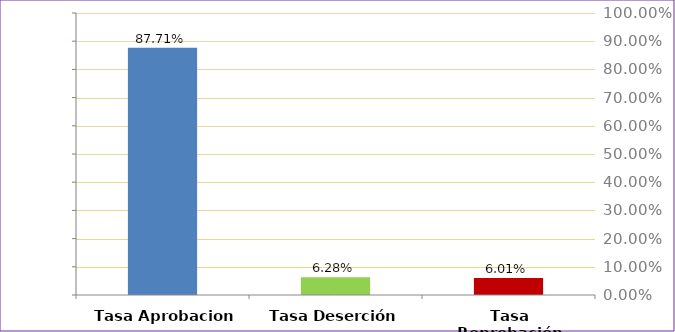
| Category | Total |
|---|---|
| Tasa Aprobacion | 0.877 |
| Tasa Deserción | 0.063 |
| Tasa Reprobación | 0.06 |